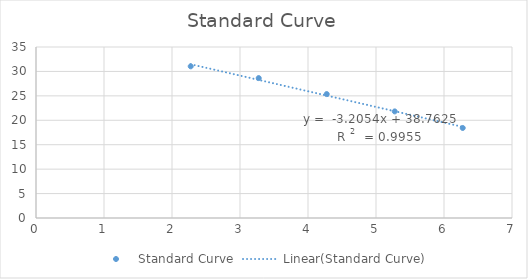
| Category | Standard Curve |
|---|---|
| 6.275167333820245 | 18.428 |
| 5.275167333820245 | 21.818 |
| 4.275167333820245 | 25.364 |
| 3.2751673338202454 | 28.639 |
| 2.2751673338202454 | 31.045 |